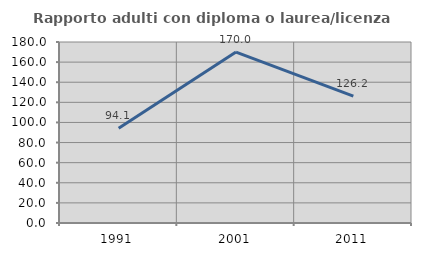
| Category | Rapporto adulti con diploma o laurea/licenza media  |
|---|---|
| 1991.0 | 94.118 |
| 2001.0 | 170 |
| 2011.0 | 126.19 |